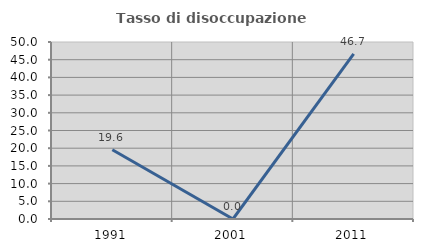
| Category | Tasso di disoccupazione giovanile  |
|---|---|
| 1991.0 | 19.565 |
| 2001.0 | 0 |
| 2011.0 | 46.667 |